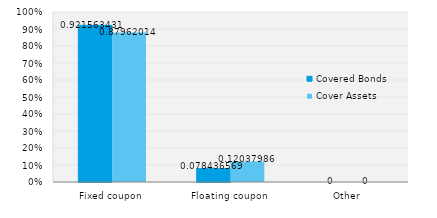
| Category | Covered Bonds | Cover Assets |
|---|---|---|
| Fixed coupon | 0.922 | 0.88 |
| Floating coupon | 0.078 | 0.12 |
| Other | 0 | 0 |